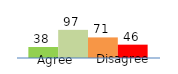
| Category | Series 0 | Series 1 | Series 2 | Series 3 |
|---|---|---|---|---|
| 0 | 38 | 97 | 71 | 46 |